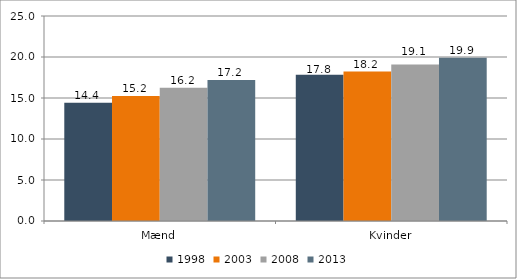
| Category | 1998 | 2003 | 2008 | 2013 |
|---|---|---|---|---|
| Mænd | 14.433 | 15.245 | 16.249 | 17.194 |
| Kvinder | 17.82 | 18.239 | 19.095 | 19.899 |